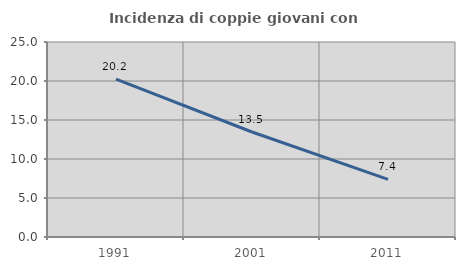
| Category | Incidenza di coppie giovani con figli |
|---|---|
| 1991.0 | 20.245 |
| 2001.0 | 13.462 |
| 2011.0 | 7.393 |